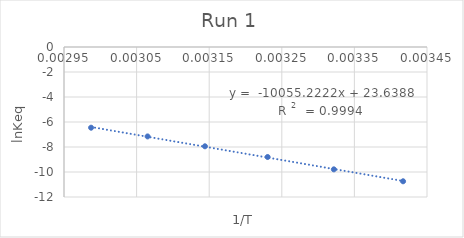
| Category | Series 0 |
|---|---|
| 0.0034170510849137197 | -10.743 |
| 0.0033217073575817976 | -9.787 |
| 0.003230495881117752 | -8.8 |
| 0.003144159723313945 | -7.943 |
| 0.0030651340996168583 | -7.154 |
| 0.002987303958177745 | -6.456 |